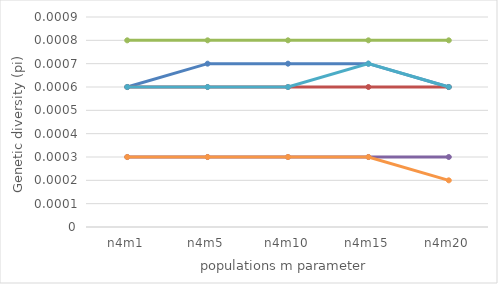
| Category | Series 0 | Series 1 | Series 2 | Series 3 | Series 4 | Series 5 |
|---|---|---|---|---|---|---|
| n4m1 | 0.001 | 0.001 | 0.001 | 0 | 0.001 | 0 |
| n4m5 | 0.001 | 0.001 | 0.001 | 0 | 0.001 | 0 |
| n4m10 | 0.001 | 0.001 | 0.001 | 0 | 0.001 | 0 |
| n4m15 | 0.001 | 0.001 | 0.001 | 0 | 0.001 | 0 |
| n4m20 | 0.001 | 0.001 | 0.001 | 0 | 0.001 | 0 |